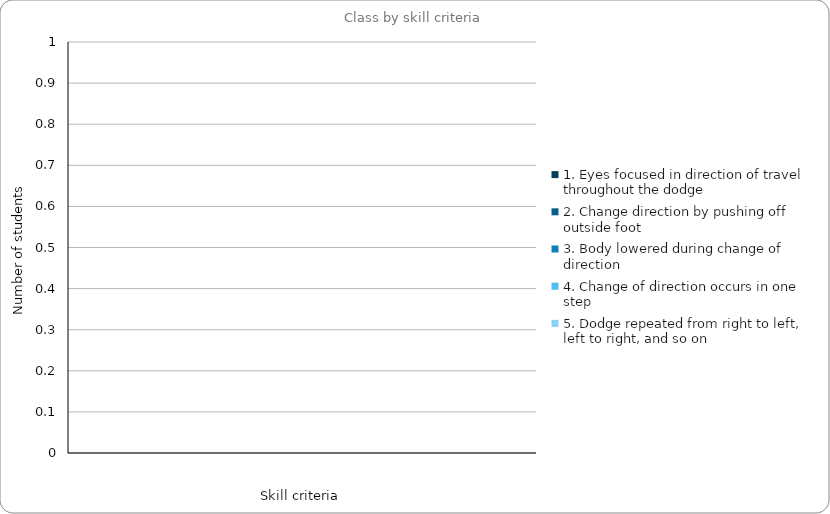
| Category | 1. Eyes focused in direction of travel throughout the dodge | 2. Change direction by pushing off outside foot | 3. Body lowered during change of direction | 4. Change of direction occurs in one step | 5. Dodge repeated from right to left, left to right, and so on |
|---|---|---|---|---|---|
| 0 | 0 | 0 | 0 | 0 | 0 |